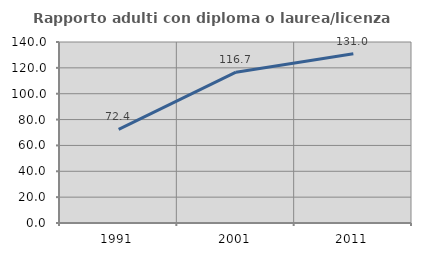
| Category | Rapporto adulti con diploma o laurea/licenza media  |
|---|---|
| 1991.0 | 72.358 |
| 2001.0 | 116.667 |
| 2011.0 | 130.968 |